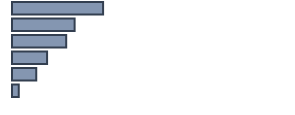
| Category | Series 0 |
|---|---|
| 0 | 33.244 |
| 1 | 22.852 |
| 2 | 19.779 |
| 3 | 12.801 |
| 4 | 8.882 |
| 5 | 2.441 |